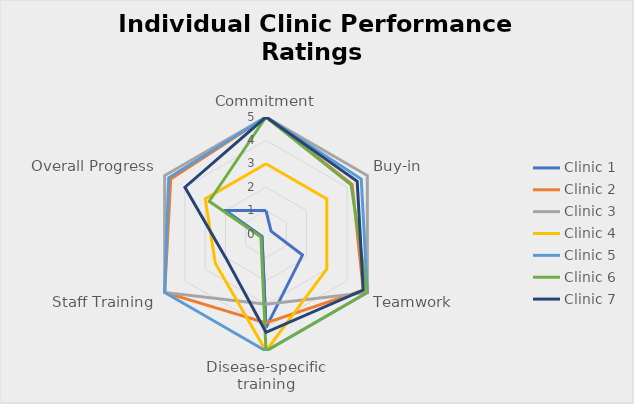
| Category | Clinic 1 | Clinic 2 | Clinic 3 | Clinic 4 | Clinic 5 | Clinic 6 | Clinic 7 |
|---|---|---|---|---|---|---|---|
| Commitment | 1 | 5 | 5 | 3 | 5 | 5 | 5 |
| Buy-in | 0.25 | 4.25 | 5 | 3 | 4.7 | 4.2 | 4.5 |
| Teamwork | 1.8 | 4.8 | 5 | 3 | 5 | 5 | 4.8 |
| Disease-specific training | 4 | 3.8 | 3 | 5 | 5 | 5 | 4.2 |
| Staff Training | 0.2 | 5 | 5 | 2.5 | 5 | 0.25 | 2 |
| Overall Progress | 2 | 4.7 | 5 | 3 | 4.8 | 2.8 | 4 |